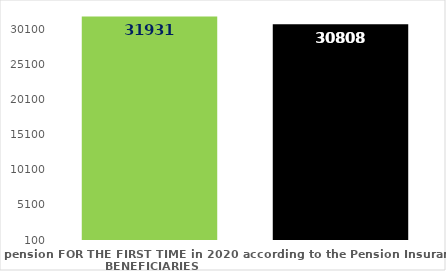
| Category | broj korisnika |
|---|---|
| Pension beneficiaries entitled to pension FOR THE FIRST TIME in 2020 according to the Pension Insurance Act  - NEW BENEFICIARIES | 31931 |
| Pension beneficiaries whose pension entitlement ceased in 2020  -  death caused,   
and who were retired according to the Pension Insurance Act   | 30808 |